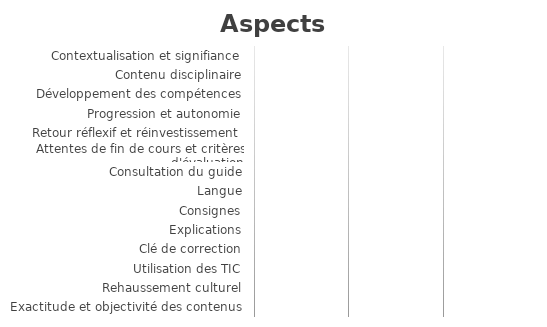
| Category | Series 0 |
|---|---|
| Contextualisation et signifiance | 0 |
| Contenu disciplinaire | 0 |
| Développement des compétences | 0 |
| Progression et autonomie | 0 |
| Retour réflexif et réinvestissement | 0 |
| Attentes de fin de cours et critères d'évaluation | 0 |
| Consultation du guide | 0 |
| Langue | 0 |
| Consignes | 0 |
| Explications | 0 |
| Clé de correction | 0 |
| Utilisation des TIC | 0 |
| Rehaussement culturel | 0 |
| Exactitude et objectivité des contenus | 0 |